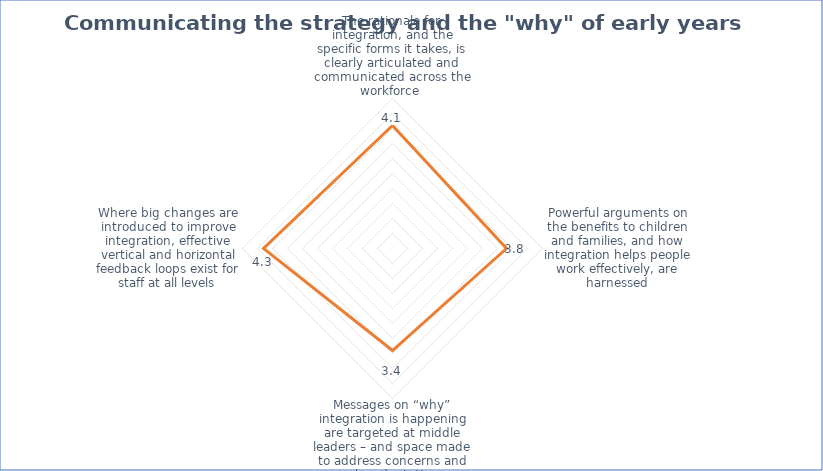
| Category | Series 0 |
|---|---|
| The rationale for integration, and the specific forms it takes, is clearly articulated and communicated across the workforce  | 4.1 |
| Powerful arguments on the benefits to children and families, and how integration helps people work effectively, are harnessed | 3.8 |
| Messages on “why” integration is happening are targeted at middle leaders – and space made to address concerns and make adaptations  | 3.4 |
| Where big changes are introduced to improve integration, effective vertical and horizontal feedback loops exist for staff at all levels | 4.3 |